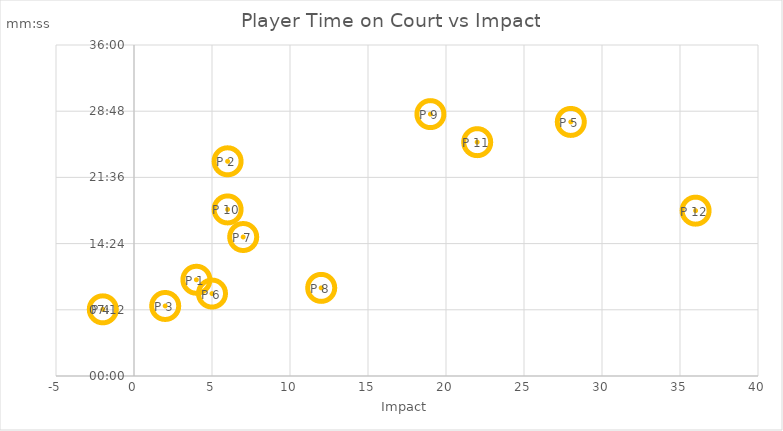
| Category | Time on Court |
|---|---|
| 4.0 | 0.007 |
| 6.0 | 0.016 |
| 2.0 | 0.005 |
| -2.0 | 0.005 |
| 28.0 | 0.019 |
| 5.0 | 0.006 |
| 7.0 | 0.01 |
| 12.0 | 0.007 |
| 19.0 | 0.02 |
| 6.0 | 0.013 |
| 22.0 | 0.018 |
| 36.0 | 0.012 |